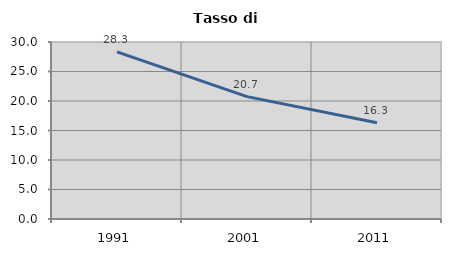
| Category | Tasso di disoccupazione   |
|---|---|
| 1991.0 | 28.316 |
| 2001.0 | 20.738 |
| 2011.0 | 16.303 |